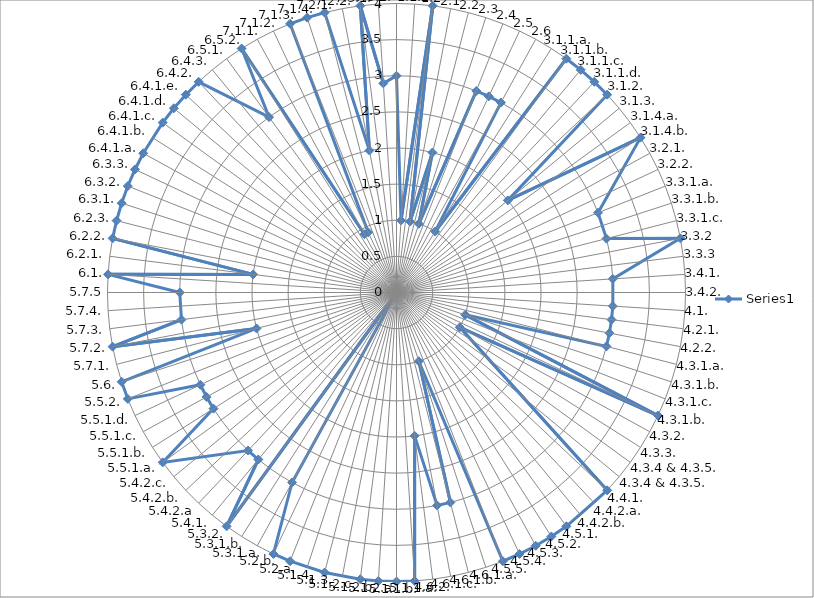
| Category | Series 0 |
|---|---|
| 1.1.1 | 3 |
| 1.1.2 | 1 |
| 1.2 | 4 |
| 2.1 | 1 |
| 2.2 | 2 |
| 2.3 | 1 |
| 2.4 | 3 |
| 2.5 | 3 |
| 2.6 | 3 |
| 3.1.1.a. | 1 |
| 3.1.1.b. | 4 |
| 3.1.1.c. | 4 |
| 3.1.1.d. | 4 |
| 3.1.2. | 4 |
| 3.1.3. | 2 |
| 3.1.4.a. | 0 |
| 3.1.4.b. | 4 |
| 3.2.1. | 0 |
| 3.2.2. | 0 |
| 3.3.1.a. | 3 |
| 3.3.1.b. | 0 |
| 3.3.1.c. | 3 |
| 3.3.2 | 4 |
| 3.3.3 | 0 |
| 3.4.1. | 3 |
| 3.4.2. | 0 |
| 4.1. | 3 |
| 4.2.1. | 3 |
| 4.2.2. | 3 |
| 4.3.1.a. | 3 |
| 4.3.1.b. | 1 |
| 4.3.1.c. | 0 |
| 4.3.1.b. | 4 |
| 4.3.2. | 1 |
| 4.3.3. | 0 |
| 4.3.4 & 4.3.5. | 0 |
| 4.3.4 & 4.3.5. | 0 |
| 4.4.1. | 4 |
| 4.4.2.a. | 0 |
| 4.4.2.b. | 0 |
| 4.5.1. | 4 |
| 4.5.2. | 4 |
| 4.5.3. | 4 |
| 4.5.4. | 4 |
| 4.5.5. | 4 |
| 4.6.1.a. | 1 |
| 4.6.1.b. | 3 |
| 4.6.1.c. | 3 |
| 4.6.2. | 2 |
| 5.1.1.a. | 4 |
| 5.1.1.b. | 4 |
| 5.1.2.a. | 4 |
| 5.1.2.b. | 4 |
| 5.1.2.c. | 0 |
| 5.1.3. | 4 |
| 5.1.4. | 0 |
| 5.2.a. | 4 |
| 5.2.b. | 4 |
| 5.3.1.a. | 3 |
| 5.3.1.b. | 0 |
| 5.3.2. | 4 |
| 5.4.1. | 3 |
| 5.4.2.a | 3 |
| 5.4.2.b. | 0 |
| 5.4.2.c. | 0 |
| 5.5.1.a. | 4 |
| 5.5.1.b. | 3 |
| 5.5.1.c. | 3 |
| 5.5.1.d. | 3 |
| 5.5.2. | 4 |
| 5.6. | 4 |
| 5.7.1. | 2 |
| 5.7.2. | 4 |
| 5.7.3. | 3 |
| 5.7.4. | 0 |
| 5.7.5 | 3 |
| 6.1. | 4 |
| 6.2.1. | 2 |
| 6.2.2. | 4 |
| 6.2.3. | 4 |
| 6.3.1. | 4 |
| 6.3.2. | 4 |
| 6.3.3. | 4 |
| 6.4.1.a. | 4 |
| 6.4.1.b. | 0 |
| 6.4.1.c. | 4 |
| 6.4.1.d. | 4 |
| 6.4.1.e. | 4 |
| 6.4.2. | 4 |
| 6.4.3. | 0 |
| 6.5.1. | 3 |
| 6.5.2. | 4 |
| 7.1.1. | 0.92 |
| 7.1.2. | 0.92 |
| 7.1.3. | 4 |
| 7.1.4. | 4 |
| 7.2.1. | 4 |
| 7.2.2. | 2 |
| 7.3.1. | 4 |
| 7.3.2. | 2.9 |